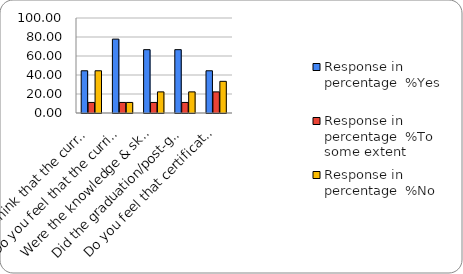
| Category | Response in percentage  |
|---|---|
| Do you think that the curriculum which you had during your graduation/post graduation has provided you with the knowledge & skills necessary to get employed/Self-employed or start own business? | 44.444 |
| Do you feel that the curriculum you studied is helpful in progression to higher studies? | 11.111 |
| Were the knowledge & skills acquired through the curriculum useful to you while working on the job?   | 22.222 |
| Did the graduation/post-graduation programme bring about any attitudinal and behavioural change in you? | 22.222 |
| Do you feel that certificate/ diploma courses offered by the college in addition to the curriculum lead to better career prospects? | 33.333 |